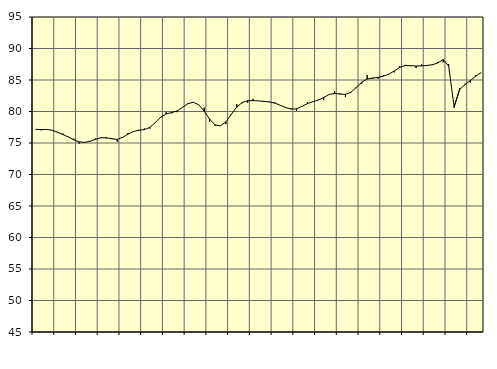
| Category | Piggar | Samtliga sysselsatta (inkl. sysselsatta utomlands)1 |
|---|---|---|
| nan | 77.2 | 77.16 |
| 1.0 | 77 | 77.13 |
| 1.0 | 77.2 | 77.15 |
| 1.0 | 77 | 77.03 |
| nan | 76.6 | 76.72 |
| 2.0 | 76.5 | 76.35 |
| 2.0 | 76 | 75.95 |
| 2.0 | 75.7 | 75.51 |
| nan | 74.9 | 75.17 |
| 3.0 | 75.1 | 75.1 |
| 3.0 | 75.3 | 75.27 |
| 3.0 | 75.7 | 75.58 |
| nan | 75.9 | 75.83 |
| 4.0 | 75.7 | 75.84 |
| 4.0 | 75.8 | 75.66 |
| 4.0 | 75.2 | 75.58 |
| nan | 75.8 | 75.89 |
| 5.0 | 76.6 | 76.41 |
| 5.0 | 76.8 | 76.84 |
| 5.0 | 77.1 | 77.02 |
| nan | 77.3 | 77.13 |
| 6.0 | 77.3 | 77.48 |
| 6.0 | 78.2 | 78.23 |
| 6.0 | 79 | 79.1 |
| nan | 79.9 | 79.63 |
| 7.0 | 79.7 | 79.82 |
| 7.0 | 79.9 | 80.08 |
| 7.0 | 80.7 | 80.65 |
| nan | 81.3 | 81.24 |
| 8.0 | 81.5 | 81.47 |
| 8.0 | 81.1 | 81.07 |
| 8.0 | 80.6 | 80.04 |
| nan | 78.4 | 78.81 |
| 9.0 | 77.7 | 77.87 |
| 9.0 | 77.7 | 77.72 |
| 9.0 | 78 | 78.37 |
| nan | 79.5 | 79.56 |
| 10.0 | 81.2 | 80.71 |
| 10.0 | 81.3 | 81.43 |
| 10.0 | 81.4 | 81.71 |
| nan | 82 | 81.73 |
| 11.0 | 81.7 | 81.68 |
| 11.0 | 81.5 | 81.61 |
| 11.0 | 81.6 | 81.52 |
| nan | 81.5 | 81.33 |
| 12.0 | 81 | 80.99 |
| 12.0 | 80.7 | 80.63 |
| 12.0 | 80.5 | 80.38 |
| nan | 80.1 | 80.43 |
| 13.0 | 80.8 | 80.82 |
| 13.0 | 81.5 | 81.25 |
| 13.0 | 81.6 | 81.55 |
| nan | 81.9 | 81.81 |
| 14.0 | 81.9 | 82.23 |
| 14.0 | 82.7 | 82.7 |
| 14.0 | 83.2 | 82.88 |
| nan | 82.9 | 82.77 |
| 15.0 | 82.3 | 82.71 |
| 15.0 | 83.1 | 83.05 |
| 15.0 | 83.7 | 83.82 |
| nan | 84.4 | 84.66 |
| 16.0 | 85.8 | 85.15 |
| 16.0 | 85.2 | 85.32 |
| 16.0 | 85.2 | 85.41 |
| nan | 85.8 | 85.61 |
| 17.0 | 85.9 | 85.94 |
| 17.0 | 86.2 | 86.44 |
| 17.0 | 87.2 | 87.02 |
| nan | 87.4 | 87.31 |
| 18.0 | 87.2 | 87.28 |
| 18.0 | 86.9 | 87.22 |
| 18.0 | 87.5 | 87.24 |
| nan | 87.3 | 87.31 |
| 19.0 | 87.5 | 87.42 |
| 19.0 | 87.9 | 87.71 |
| 19.0 | 87.8 | 88.25 |
| nan | 87.5 | 87.22 |
| 20.0 | 80.6 | 80.72 |
| 20.0 | 83.7 | 83.47 |
| 20.0 | 84.4 | 84.29 |
| nan | 84.6 | 84.92 |
| 21.0 | 85.8 | 85.61 |
| 21.0 | 86.2 | 86.2 |